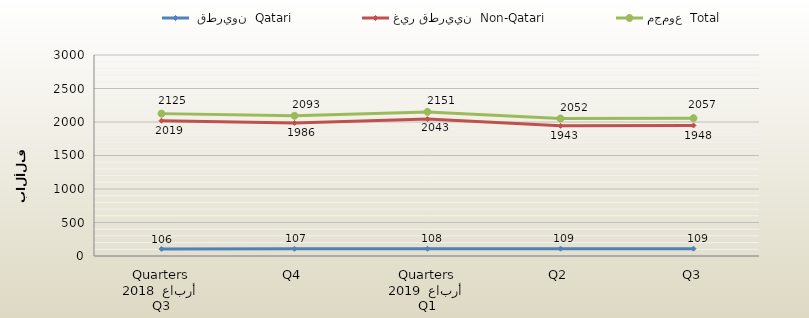
| Category |  قطريون  Qatari | غير قطريين  Non-Qatari | مجموع  Total |
|---|---|---|---|
| 0 | 106 | 2019 | 2125 |
| 1 | 107 | 1986 | 2093 |
| 2 | 108 | 2043 | 2151 |
| 3 | 109 | 1943 | 2052 |
| 4 | 109 | 1948 | 2057 |